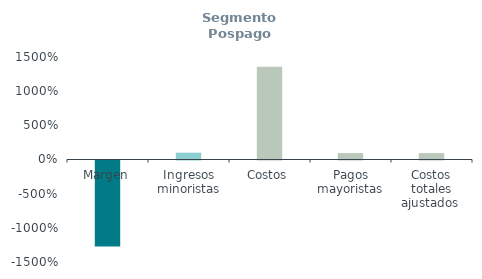
| Category | Segmento Pospago
(% ingresos) |
|---|---|
| Margen | -12.579 |
| Ingresos minoristas | 1 |
| Costos | 13.579 |
| Pagos mayoristas | 0.937 |
| Costos totales ajustados  | 0.931 |